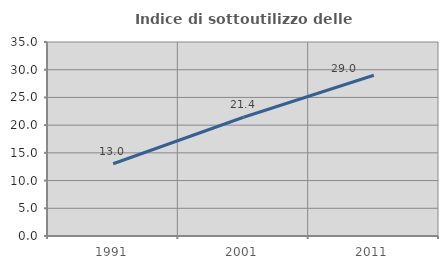
| Category | Indice di sottoutilizzo delle abitazioni  |
|---|---|
| 1991.0 | 13.03 |
| 2001.0 | 21.429 |
| 2011.0 | 29 |